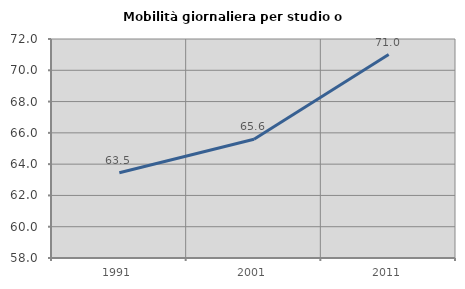
| Category | Mobilità giornaliera per studio o lavoro |
|---|---|
| 1991.0 | 63.45 |
| 2001.0 | 65.595 |
| 2011.0 | 71.005 |